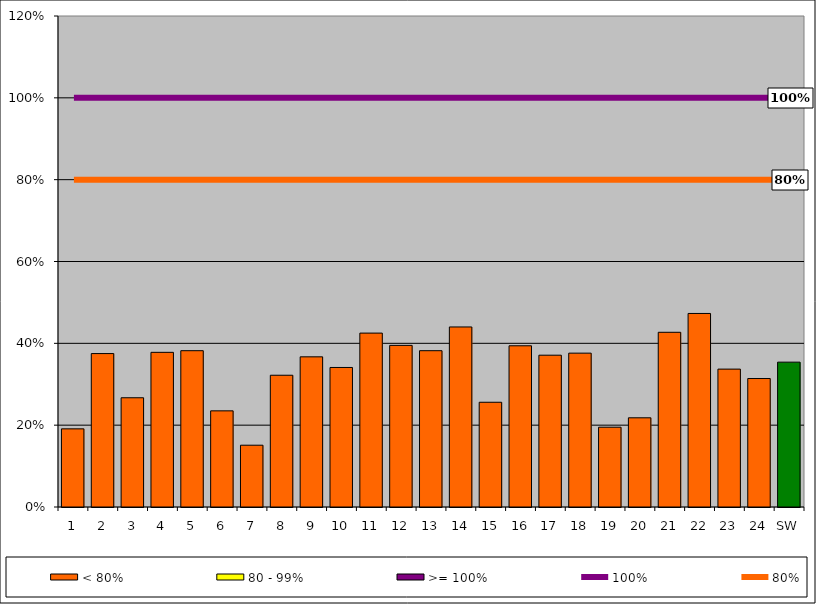
| Category | < 80% | 80 - 99% | >= 100% |
|---|---|---|---|
| 1 | 0.191 | 0 | 0 |
| 2 | 0.375 | 0 | 0 |
| 3 | 0.267 | 0 | 0 |
| 4 | 0.378 | 0 | 0 |
| 5 | 0.382 | 0 | 0 |
| 6 | 0.235 | 0 | 0 |
| 7 | 0.151 | 0 | 0 |
| 8 | 0.322 | 0 | 0 |
| 9 | 0.367 | 0 | 0 |
| 10 | 0.341 | 0 | 0 |
| 11 | 0.425 | 0 | 0 |
| 12 | 0.395 | 0 | 0 |
| 13 | 0.382 | 0 | 0 |
| 14 | 0.44 | 0 | 0 |
| 15 | 0.256 | 0 | 0 |
| 16 | 0.394 | 0 | 0 |
| 17 | 0.371 | 0 | 0 |
| 18 | 0.376 | 0 | 0 |
| 19 | 0.195 | 0 | 0 |
| 20 | 0.218 | 0 | 0 |
| 21 | 0.427 | 0 | 0 |
| 22 | 0.473 | 0 | 0 |
| 23 | 0.337 | 0 | 0 |
| 24 | 0.314 | 0 | 0 |
| SW | 0.354 | 0 | 0 |